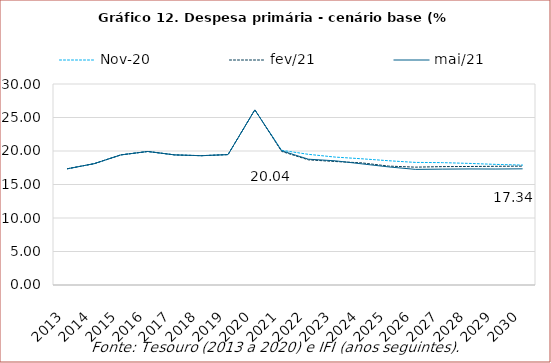
| Category | nov/20 | fev/21 | mai/21 |
|---|---|---|---|
| 2013.0 | 17.348 | 17.348 | 17.348 |
| 2014.0 | 18.109 | 18.109 | 18.109 |
| 2015.0 | 19.421 | 19.421 | 19.421 |
| 2016.0 | 19.929 | 19.929 | 19.929 |
| 2017.0 | 19.422 | 19.422 | 19.422 |
| 2018.0 | 19.299 | 19.299 | 19.299 |
| 2019.0 | 19.466 | 19.466 | 19.466 |
| 2020.0 | 26.142 | 26.142 | 26.142 |
| 2021.0 | 20.106 | 19.939 | 20.038 |
| 2022.0 | 19.503 | 18.681 | 18.777 |
| 2023.0 | 19.092 | 18.432 | 18.536 |
| 2024.0 | 18.837 | 18.225 | 18.08 |
| 2025.0 | 18.546 | 17.747 | 17.625 |
| 2026.0 | 18.297 | 17.59 | 17.257 |
| 2027.0 | 18.266 | 17.668 | 17.296 |
| 2028.0 | 18.15 | 17.687 | 17.321 |
| 2029.0 | 18.001 | 17.715 | 17.31 |
| 2030.0 | 17.897 | 17.741 | 17.34 |